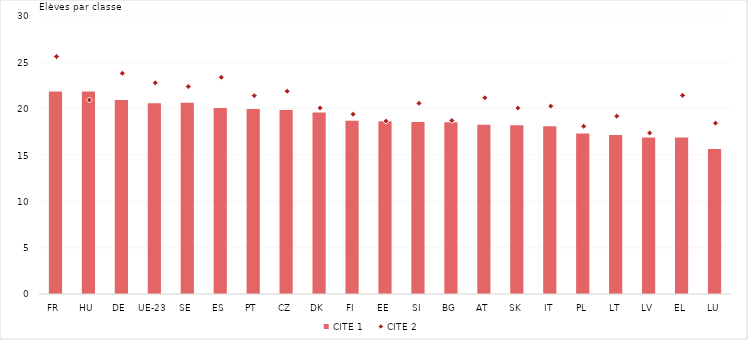
| Category | CITE 1 |
|---|---|
| FR | 21.855 |
| HU | 21.848 |
| DE | 20.941 |
| UE-23 | 20.584 |
| SE | 20.648 |
| ES | 20.073 |
| PT | 19.954 |
| CZ | 19.858 |
| DK | 19.593 |
| FI | 18.693 |
| EE | 18.638 |
| SI | 18.566 |
| BG | 18.535 |
| AT | 18.267 |
| SK | 18.207 |
| IT | 18.106 |
| PL | 17.31 |
| LT | 17.167 |
| LV | 16.892 |
| EL | 16.881 |
| LU | 15.649 |